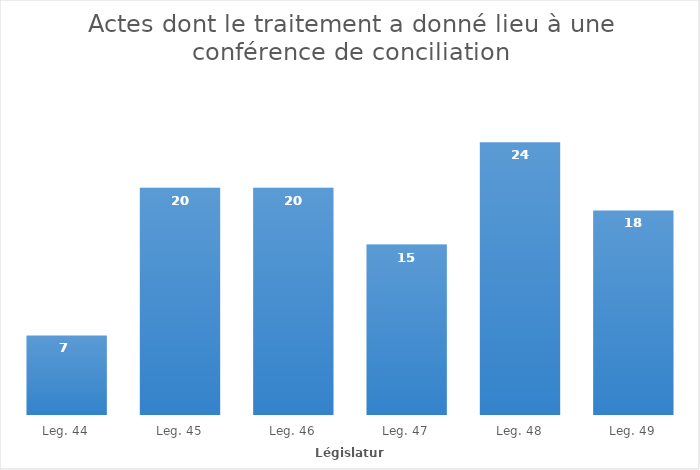
| Category |   -   |
|---|---|
| Leg. 44 | 7 |
| Leg. 45 | 20 |
| Leg. 46 | 20 |
| Leg. 47 | 15 |
| Leg. 48 | 24 |
| Leg. 49 | 18 |